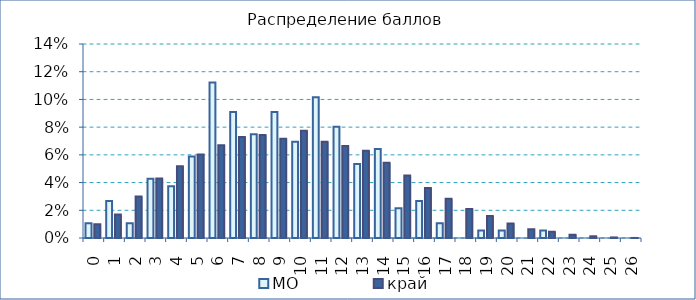
| Category | МО | край |
|---|---|---|
| 0.0 | 0.011 | 0.01 |
| 1.0 | 0.027 | 0.017 |
| 2.0 | 0.011 | 0.03 |
| 3.0 | 0.043 | 0.043 |
| 4.0 | 0.037 | 0.052 |
| 5.0 | 0.059 | 0.06 |
| 6.0 | 0.112 | 0.067 |
| 7.0 | 0.091 | 0.073 |
| 8.0 | 0.075 | 0.074 |
| 9.0 | 0.091 | 0.072 |
| 10.0 | 0.07 | 0.077 |
| 11.0 | 0.102 | 0.069 |
| 12.0 | 0.08 | 0.066 |
| 13.0 | 0.053 | 0.063 |
| 14.0 | 0.064 | 0.054 |
| 15.0 | 0.021 | 0.045 |
| 16.0 | 0.027 | 0.036 |
| 17.0 | 0.011 | 0.028 |
| 18.0 | 0 | 0.021 |
| 19.0 | 0.005 | 0.016 |
| 20.0 | 0.005 | 0.011 |
| 21.0 | 0 | 0.006 |
| 22.0 | 0.005 | 0.004 |
| 23.0 | 0 | 0.002 |
| 24.0 | 0 | 0.001 |
| 25.0 | 0 | 0 |
| 26.0 | 0 | 0 |